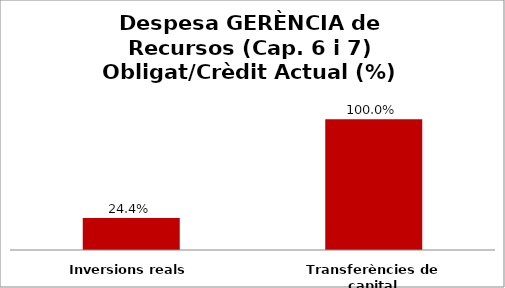
| Category | Series 0 |
|---|---|
| Inversions reals | 0.244 |
| Transferències de capital | 1 |